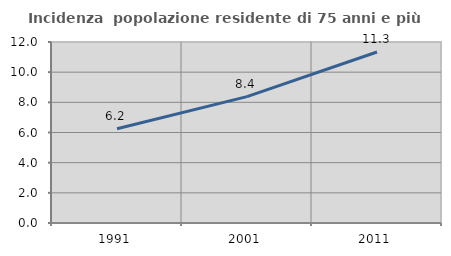
| Category | Incidenza  popolazione residente di 75 anni e più |
|---|---|
| 1991.0 | 6.244 |
| 2001.0 | 8.376 |
| 2011.0 | 11.338 |